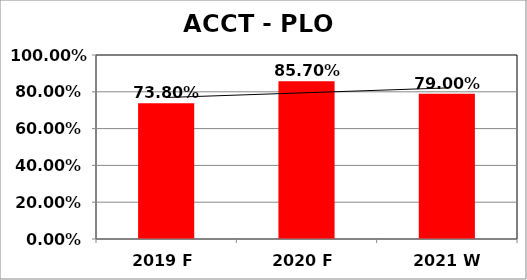
| Category | Series 0 |
|---|---|
| 2019 F | 0.738 |
| 2020 F | 0.857 |
| 2021 W | 0.79 |